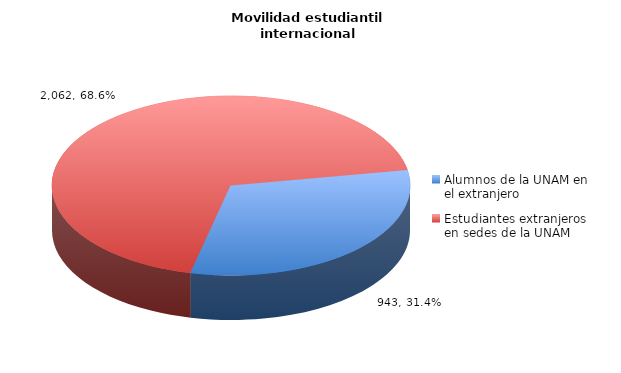
| Category | Series 0 |
|---|---|
| Alumnos de la UNAM en el extranjero | 943 |
| Estudiantes extranjeros en sedes de la UNAM | 2062 |